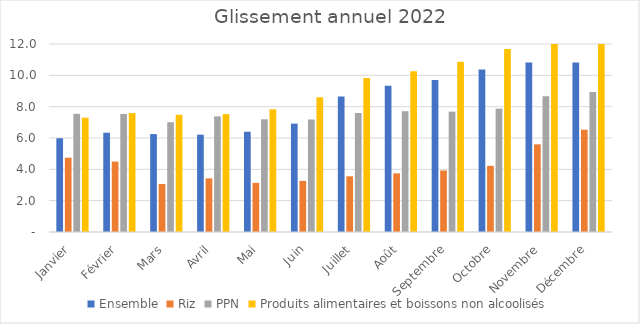
| Category |  Ensemble  |  Riz  |  PPN  |  Produits alimentaires et boissons non alcoolisés  |
|---|---|---|---|---|
| Janvier | 5.984 | 4.745 | 7.54 | 7.297 |
| Février | 6.337 | 4.495 | 7.537 | 7.591 |
| Mars | 6.249 | 3.066 | 7.006 | 7.484 |
| Avril | 6.212 | 3.424 | 7.38 | 7.523 |
| Mai | 6.399 | 3.134 | 7.195 | 7.832 |
| Juin | 6.919 | 3.263 | 7.182 | 8.599 |
| Juillet | 8.653 | 3.555 | 7.593 | 9.833 |
| Août | 9.327 | 3.744 | 7.709 | 10.254 |
| Septembre | 9.698 | 3.929 | 7.684 | 10.86 |
| Octobre | 10.366 | 4.224 | 7.875 | 11.681 |
| Novembre | 10.824 | 5.593 | 8.673 | 12.372 |
| Décembre | 10.823 | 6.527 | 8.929 | 12.57 |